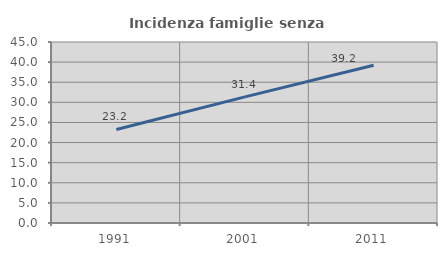
| Category | Incidenza famiglie senza nuclei |
|---|---|
| 1991.0 | 23.249 |
| 2001.0 | 31.364 |
| 2011.0 | 39.21 |